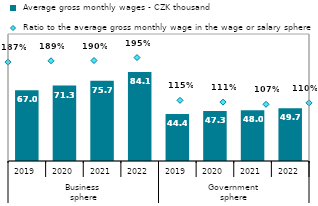
| Category |  Average gross monthly wages - CZK thousand |
|---|---|
| 0 | 66.964 |
| 1 | 71.258 |
| 2 | 75.718 |
| 3 | 84.052 |
| 4 | 44.351 |
| 5 | 47.347 |
| 6 | 47.968 |
| 7 | 49.736 |